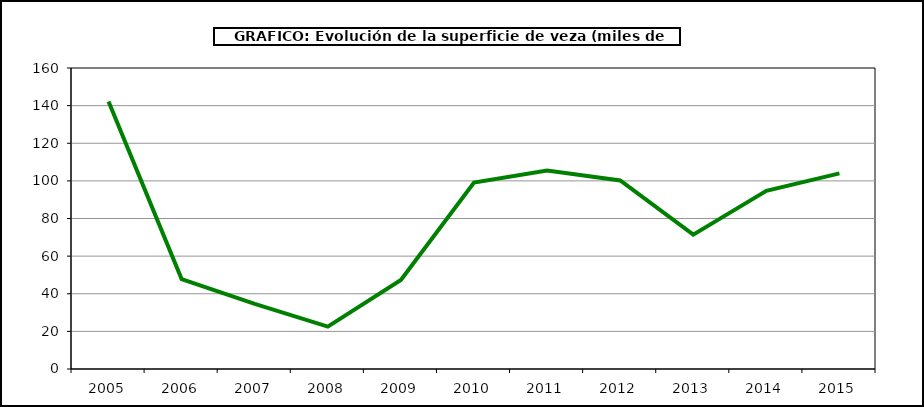
| Category | Superficie |
|---|---|
| 2005.0 | 142.14 |
| 2006.0 | 47.791 |
| 2007.0 | 34.592 |
| 2008.0 | 22.52 |
| 2009.0 | 47.3 |
| 2010.0 | 99.058 |
| 2011.0 | 105.49 |
| 2012.0 | 100.2 |
| 2013.0 | 71.44 |
| 2014.0 | 94.69 |
| 2015.0 | 103.977 |